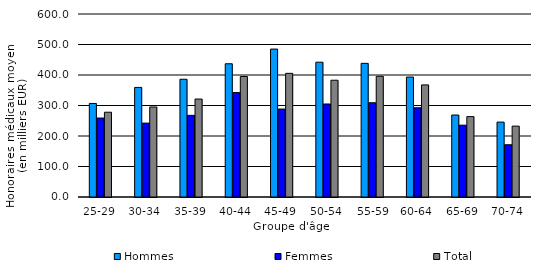
| Category | Hommes | Femmes | Total |
|---|---|---|---|
| 25-29 | 306.674 | 258.909 | 278.015 |
| 30-34 | 359.29 | 242.242 | 295.234 |
| 35-39 | 386.025 | 267.753 | 321.183 |
| 40-44 | 436.863 | 342.331 | 395.051 |
| 45-49 | 485.011 | 288.365 | 405.459 |
| 50-54 | 441.995 | 304.944 | 382.841 |
|  55-59 | 438.162 | 308.992 | 395.734 |
| 60-64 | 393.289 | 292.543 | 367.526 |
| 65-69 | 268.75 | 235.536 | 263.622 |
| 70-74 | 245.573 | 171.356 | 232.379 |